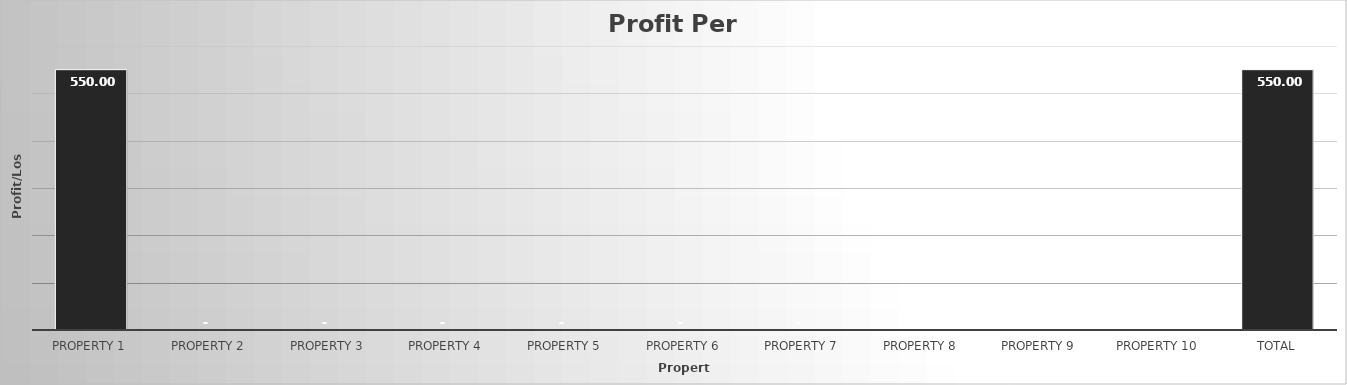
| Category | Series 0 |
|---|---|
| Property 1 | 550 |
| Property 2 | 0 |
| Property 3 | 0 |
| Property 4 | 0 |
| Property 5 | 0 |
| Property 6 | 0 |
| Property 7 | 0 |
| Property 8 | 0 |
| Property 9 | 0 |
| Property 10 | 0 |
| Total | 550 |